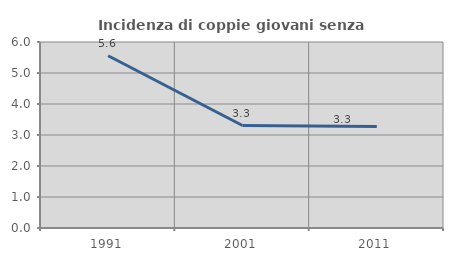
| Category | Incidenza di coppie giovani senza figli |
|---|---|
| 1991.0 | 5.556 |
| 2001.0 | 3.306 |
| 2011.0 | 3.277 |